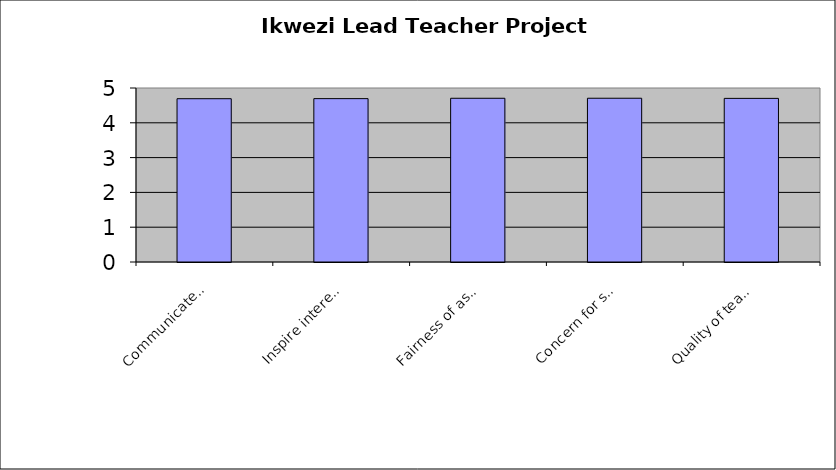
| Category | Series 0 |
|---|---|
| Communicates about content | 4.692 |
| Inspire interest | 4.694 |
| Fairness of assessment | 4.705 |
| Concern for students' learning | 4.706 |
| Quality of teaching | 4.702 |